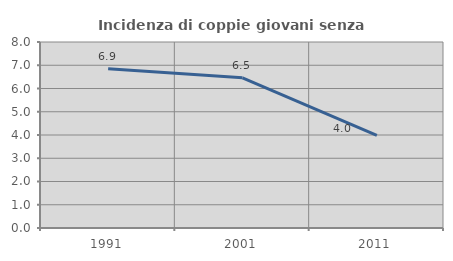
| Category | Incidenza di coppie giovani senza figli |
|---|---|
| 1991.0 | 6.852 |
| 2001.0 | 6.458 |
| 2011.0 | 3.986 |